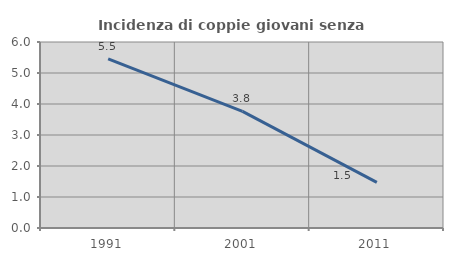
| Category | Incidenza di coppie giovani senza figli |
|---|---|
| 1991.0 | 5.455 |
| 2001.0 | 3.763 |
| 2011.0 | 1.471 |